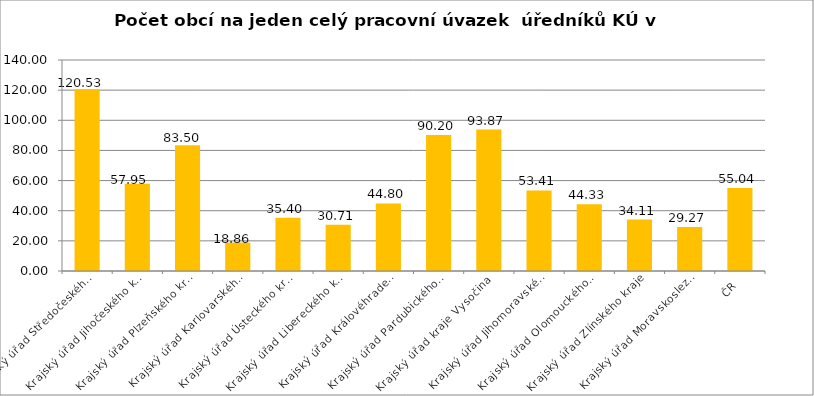
| Category | Počet obcí na jeden celý pracovní úvazek  úředníků KÚ |
|---|---|
| Krajský úřad Středočeského kraje | 120.526 |
| Krajský úřad Jihočeského kraje | 57.953 |
| Krajský úřad Plzeňského kraje | 83.5 |
| Krajský úřad Karlovarského kraje | 18.857 |
| Krajský úřad Ústeckého kraje | 35.4 |
| Krajský úřad Libereckého kraje | 30.714 |
| Krajský úřad Královéhradeckého kraje | 44.8 |
| Krajský úřad Pardubického kraje | 90.2 |
| Krajský úřad kraje Vysočina | 93.867 |
| Krajský úřad Jihomoravského kraje | 53.413 |
| Krajský úřad Olomouckého kraje | 44.333 |
| Krajský úřad Zlínského kraje | 34.111 |
| Krajský úřad Moravskoslezského kraje | 29.268 |
| ČR | 55.035 |